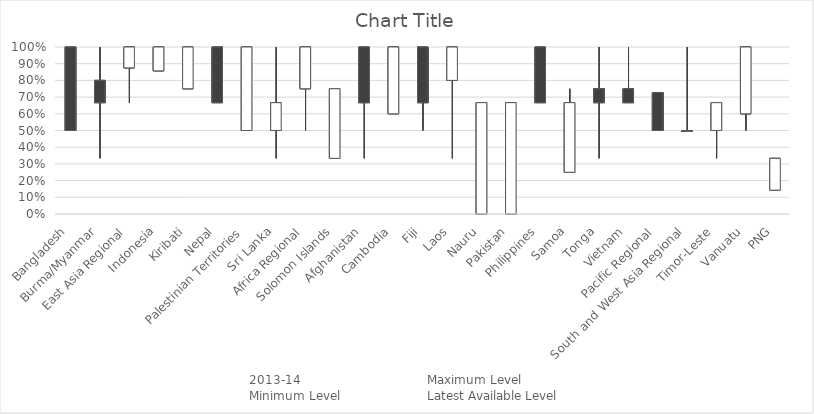
| Category | 2013-14 | Maximum Level | Minimum Level | Latest Available Level |
|---|---|---|---|---|
| Bangladesh | 1 | 1 | 0.5 | 0.5 |
| Burma/Myanmar | 0.8 | 1 | 0.333 | 0.667 |
| East Asia Regional | 0.875 | 1 | 0.667 | 1 |
| Indonesia | 0.857 | 1 | 0.857 | 1 |
| Kiribati | 0.75 | 1 | 0.75 | 1 |
| Nepal | 1 | 1 | 0.667 | 0.667 |
| Palestinian Territories | 0.5 | 1 | 0.5 | 1 |
| Sri Lanka | 0.5 | 1 | 0.333 | 0.667 |
| Africa Regional | 0.75 | 1 | 0.5 | 1 |
| Solomon Islands | 0.333 | 0.75 | 0.333 | 0.75 |
| Afghanistan | 1 | 1 | 0.333 | 0.667 |
| Cambodia | 0.6 | 1 | 0.6 | 1 |
| Fiji | 1 | 1 | 0.5 | 0.667 |
| Laos | 0.8 | 1 | 0.333 | 1 |
| Nauru | 0 | 0.667 | 0 | 0.667 |
| Pakistan | 0 | 0.667 | 0 | 0.667 |
| Philippines | 1 | 1 | 0.667 | 0.667 |
| Samoa | 0.25 | 0.75 | 0.25 | 0.667 |
| Tonga | 0.75 | 1 | 0.333 | 0.667 |
| Vietnam | 0.75 | 1 | 0.667 | 0.667 |
| Pacific Regional | 0.727 | 0.727 | 0.5 | 0.5 |
| South and West Asia Regional | 0.5 | 1 | 0.5 | 0.5 |
| Timor-Leste | 0.5 | 0.667 | 0.333 | 0.667 |
| Vanuatu | 0.6 | 1 | 0.5 | 1 |
| PNG | 0.143 | 0.333 | 0.143 | 0.333 |